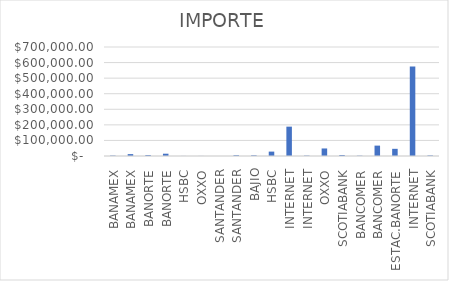
| Category | IMPORTE |
|---|---|
| BANAMEX | 2797.54 |
| BANAMEX | 12113.4 |
| BANORTE | 6012.21 |
| BANORTE | 14706 |
| HSBC | 422.18 |
| OXXO | 420 |
| SANTANDER | 71.41 |
| SANTANDER | 5118.78 |
| BAJIO | 4408.43 |
| HSBC | 28253.93 |
| INTERNET | 188519.82 |
| INTERNET | 2527 |
| OXXO | 48381.79 |
| SCOTIABANK | 6324.86 |
| BANCOMER | 1982.88 |
| BANCOMER | 66671.08 |
| ESTAC.BANORTE | 46103 |
| INTERNET | 574773.11 |
| SCOTIABANK | 3523.48 |